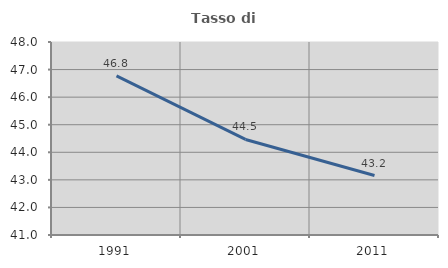
| Category | Tasso di occupazione   |
|---|---|
| 1991.0 | 46.769 |
| 2001.0 | 44.465 |
| 2011.0 | 43.157 |